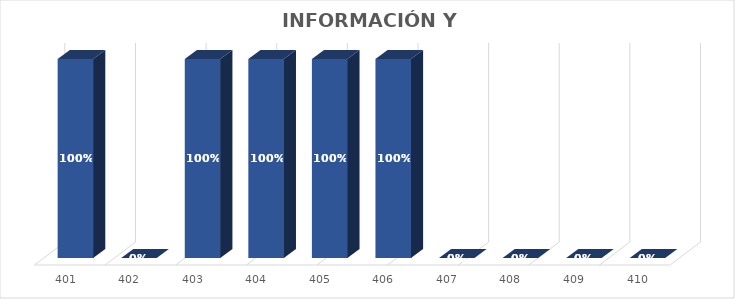
| Category | % Avance |
|---|---|
| 401.0 | 1 |
| 402.0 | 0 |
| 403.0 | 1 |
| 404.0 | 1 |
| 405.0 | 1 |
| 406.0 | 1 |
| 407.0 | 0 |
| 408.0 | 0 |
| 409.0 | 0 |
| 410.0 | 0 |